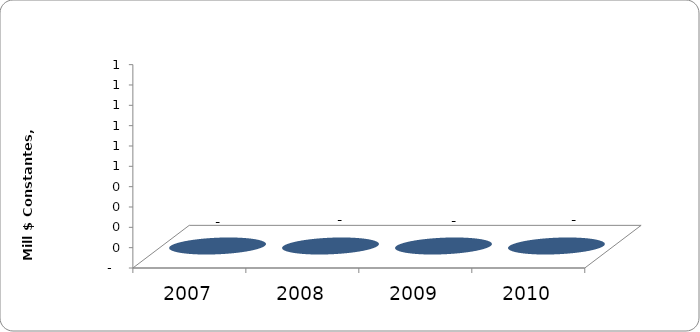
| Category | SALDO DE DEUDA FINANCIERA |
|---|---|
| 2007 | 0 |
| 2008 | 0 |
| 2009 | 0 |
| 2010 | 0 |